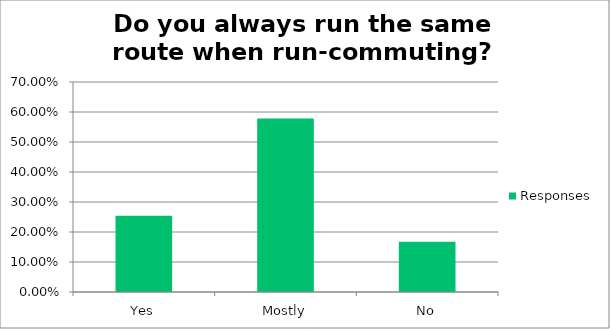
| Category | Responses |
|---|---|
| Yes | 0.254 |
| Mostly | 0.578 |
| No | 0.167 |